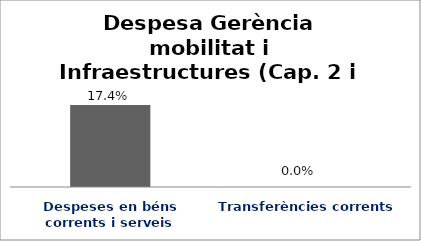
| Category | Series 0 |
|---|---|
| Despeses en béns corrents i serveis | 0.174 |
| Transferències corrents | 0 |